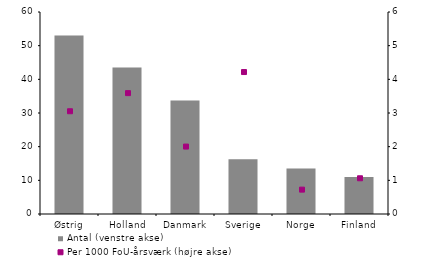
| Category | Antal (venstre akse) |
|---|---|
| Østrig | 53 |
| Holland | 43.5 |
| Danmark | 33.75 |
| Sverige | 16.25 |
| Norge | 13.5 |
| Finland | 11 |